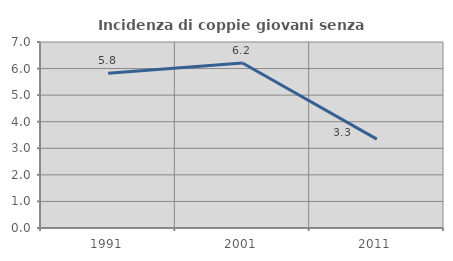
| Category | Incidenza di coppie giovani senza figli |
|---|---|
| 1991.0 | 5.823 |
| 2001.0 | 6.212 |
| 2011.0 | 3.345 |